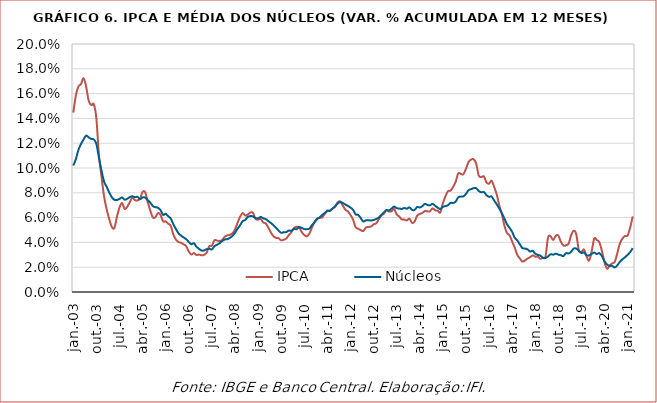
| Category | IPCA | Núcleos |
|---|---|---|
| 2003-01-01 | 0.145 | 0.102 |
| 2003-02-01 | 0.158 | 0.107 |
| 2003-03-01 | 0.166 | 0.115 |
| 2003-04-01 | 0.168 | 0.119 |
| 2003-05-01 | 0.172 | 0.123 |
| 2003-06-01 | 0.166 | 0.126 |
| 2003-07-01 | 0.154 | 0.125 |
| 2003-08-01 | 0.151 | 0.123 |
| 2003-09-01 | 0.151 | 0.123 |
| 2003-10-01 | 0.14 | 0.119 |
| 2003-11-01 | 0.11 | 0.108 |
| 2003-12-01 | 0.093 | 0.098 |
| 2004-01-01 | 0.077 | 0.089 |
| 2004-02-01 | 0.067 | 0.085 |
| 2004-03-01 | 0.059 | 0.08 |
| 2004-04-01 | 0.053 | 0.077 |
| 2004-05-01 | 0.052 | 0.074 |
| 2004-06-01 | 0.061 | 0.074 |
| 2004-07-01 | 0.068 | 0.075 |
| 2004-08-01 | 0.072 | 0.076 |
| 2004-09-01 | 0.067 | 0.074 |
| 2004-10-01 | 0.069 | 0.075 |
| 2004-11-01 | 0.072 | 0.076 |
| 2004-12-01 | 0.076 | 0.077 |
| 2005-01-01 | 0.074 | 0.076 |
| 2005-02-01 | 0.074 | 0.077 |
| 2005-03-01 | 0.075 | 0.075 |
| 2005-04-01 | 0.081 | 0.076 |
| 2005-05-01 | 0.081 | 0.076 |
| 2005-06-01 | 0.073 | 0.074 |
| 2005-07-01 | 0.066 | 0.072 |
| 2005-08-01 | 0.06 | 0.069 |
| 2005-09-01 | 0.06 | 0.068 |
| 2005-10-01 | 0.064 | 0.068 |
| 2005-11-01 | 0.062 | 0.066 |
| 2005-12-01 | 0.057 | 0.062 |
| 2006-01-01 | 0.057 | 0.063 |
| 2006-02-01 | 0.055 | 0.061 |
| 2006-03-01 | 0.053 | 0.059 |
| 2006-04-01 | 0.046 | 0.055 |
| 2006-05-01 | 0.042 | 0.051 |
| 2006-06-01 | 0.04 | 0.047 |
| 2006-07-01 | 0.04 | 0.045 |
| 2006-08-01 | 0.038 | 0.044 |
| 2006-09-01 | 0.037 | 0.043 |
| 2006-10-01 | 0.033 | 0.04 |
| 2006-11-01 | 0.03 | 0.039 |
| 2006-12-01 | 0.031 | 0.039 |
| 2007-01-01 | 0.03 | 0.036 |
| 2007-02-01 | 0.03 | 0.035 |
| 2007-03-01 | 0.03 | 0.033 |
| 2007-04-01 | 0.03 | 0.034 |
| 2007-05-01 | 0.032 | 0.035 |
| 2007-06-01 | 0.037 | 0.035 |
| 2007-07-01 | 0.037 | 0.034 |
| 2007-08-01 | 0.042 | 0.037 |
| 2007-09-01 | 0.041 | 0.038 |
| 2007-10-01 | 0.041 | 0.039 |
| 2007-11-01 | 0.042 | 0.041 |
| 2007-12-01 | 0.045 | 0.042 |
| 2008-01-01 | 0.046 | 0.043 |
| 2008-02-01 | 0.046 | 0.044 |
| 2008-03-01 | 0.047 | 0.045 |
| 2008-04-01 | 0.05 | 0.048 |
| 2008-05-01 | 0.056 | 0.051 |
| 2008-06-01 | 0.061 | 0.054 |
| 2008-07-01 | 0.064 | 0.057 |
| 2008-08-01 | 0.062 | 0.058 |
| 2008-09-01 | 0.063 | 0.061 |
| 2008-10-01 | 0.064 | 0.061 |
| 2008-11-01 | 0.064 | 0.061 |
| 2008-12-01 | 0.059 | 0.06 |
| 2009-01-01 | 0.058 | 0.059 |
| 2009-02-01 | 0.059 | 0.061 |
| 2009-03-01 | 0.056 | 0.059 |
| 2009-04-01 | 0.055 | 0.059 |
| 2009-05-01 | 0.052 | 0.057 |
| 2009-06-01 | 0.048 | 0.056 |
| 2009-07-01 | 0.045 | 0.054 |
| 2009-08-01 | 0.044 | 0.052 |
| 2009-09-01 | 0.043 | 0.05 |
| 2009-10-01 | 0.042 | 0.048 |
| 2009-11-01 | 0.042 | 0.048 |
| 2009-12-01 | 0.043 | 0.048 |
| 2010-01-01 | 0.046 | 0.05 |
| 2010-02-01 | 0.048 | 0.049 |
| 2010-03-01 | 0.052 | 0.051 |
| 2010-04-01 | 0.053 | 0.051 |
| 2010-05-01 | 0.052 | 0.052 |
| 2010-06-01 | 0.048 | 0.052 |
| 2010-07-01 | 0.046 | 0.051 |
| 2010-08-01 | 0.045 | 0.051 |
| 2010-09-01 | 0.047 | 0.051 |
| 2010-10-01 | 0.052 | 0.054 |
| 2010-11-01 | 0.056 | 0.056 |
| 2010-12-01 | 0.059 | 0.059 |
| 2011-01-01 | 0.06 | 0.06 |
| 2011-02-01 | 0.06 | 0.062 |
| 2011-03-01 | 0.063 | 0.064 |
| 2011-04-01 | 0.065 | 0.066 |
| 2011-05-01 | 0.066 | 0.065 |
| 2011-06-01 | 0.067 | 0.067 |
| 2011-07-01 | 0.069 | 0.069 |
| 2011-08-01 | 0.072 | 0.071 |
| 2011-09-01 | 0.073 | 0.073 |
| 2011-10-01 | 0.07 | 0.072 |
| 2011-11-01 | 0.066 | 0.071 |
| 2011-12-01 | 0.065 | 0.069 |
| 2012-01-01 | 0.062 | 0.068 |
| 2012-02-01 | 0.058 | 0.066 |
| 2012-03-01 | 0.052 | 0.063 |
| 2012-04-01 | 0.051 | 0.062 |
| 2012-05-01 | 0.05 | 0.06 |
| 2012-06-01 | 0.049 | 0.057 |
| 2012-07-01 | 0.052 | 0.058 |
| 2012-08-01 | 0.052 | 0.058 |
| 2012-09-01 | 0.053 | 0.058 |
| 2012-10-01 | 0.055 | 0.058 |
| 2012-11-01 | 0.055 | 0.059 |
| 2012-12-01 | 0.058 | 0.06 |
| 2013-01-01 | 0.062 | 0.062 |
| 2013-02-01 | 0.063 | 0.064 |
| 2013-03-01 | 0.066 | 0.066 |
| 2013-04-01 | 0.065 | 0.066 |
| 2013-05-01 | 0.065 | 0.067 |
| 2013-06-01 | 0.067 | 0.069 |
| 2013-07-01 | 0.063 | 0.068 |
| 2013-08-01 | 0.061 | 0.067 |
| 2013-09-01 | 0.059 | 0.067 |
| 2013-10-01 | 0.058 | 0.068 |
| 2013-11-01 | 0.058 | 0.067 |
| 2013-12-01 | 0.059 | 0.068 |
| 2014-01-01 | 0.056 | 0.066 |
| 2014-02-01 | 0.057 | 0.066 |
| 2014-03-01 | 0.062 | 0.069 |
| 2014-04-01 | 0.063 | 0.068 |
| 2014-05-01 | 0.064 | 0.069 |
| 2014-06-01 | 0.065 | 0.071 |
| 2014-07-01 | 0.065 | 0.07 |
| 2014-08-01 | 0.065 | 0.07 |
| 2014-09-01 | 0.067 | 0.071 |
| 2014-10-01 | 0.066 | 0.07 |
| 2014-11-01 | 0.066 | 0.068 |
| 2014-12-01 | 0.064 | 0.067 |
| 2015-01-01 | 0.071 | 0.069 |
| 2015-02-01 | 0.077 | 0.069 |
| 2015-03-01 | 0.081 | 0.07 |
| 2015-04-01 | 0.082 | 0.072 |
| 2015-05-01 | 0.085 | 0.072 |
| 2015-06-01 | 0.089 | 0.073 |
| 2015-07-01 | 0.096 | 0.076 |
| 2015-08-01 | 0.095 | 0.077 |
| 2015-09-01 | 0.095 | 0.077 |
| 2015-10-01 | 0.099 | 0.079 |
| 2015-11-01 | 0.105 | 0.082 |
| 2015-12-01 | 0.107 | 0.083 |
| 2016-01-01 | 0.107 | 0.084 |
| 2016-02-01 | 0.104 | 0.084 |
| 2016-03-01 | 0.094 | 0.081 |
| 2016-04-01 | 0.093 | 0.08 |
| 2016-05-01 | 0.093 | 0.081 |
| 2016-06-01 | 0.088 | 0.078 |
| 2016-07-01 | 0.087 | 0.077 |
| 2016-08-01 | 0.09 | 0.077 |
| 2016-09-01 | 0.085 | 0.074 |
| 2016-10-01 | 0.079 | 0.071 |
| 2016-11-01 | 0.07 | 0.067 |
| 2016-12-01 | 0.063 | 0.064 |
| 2017-01-01 | 0.054 | 0.059 |
| 2017-02-01 | 0.048 | 0.055 |
| 2017-03-01 | 0.046 | 0.052 |
| 2017-04-01 | 0.041 | 0.049 |
| 2017-05-01 | 0.036 | 0.044 |
| 2017-06-01 | 0.03 | 0.042 |
| 2017-07-01 | 0.027 | 0.038 |
| 2017-08-01 | 0.025 | 0.035 |
| 2017-09-01 | 0.025 | 0.035 |
| 2017-10-01 | 0.027 | 0.034 |
| 2017-11-01 | 0.028 | 0.033 |
| 2017-12-01 | 0.029 | 0.033 |
| 2018-01-01 | 0.029 | 0.031 |
| 2018-02-01 | 0.028 | 0.03 |
| 2018-03-01 | 0.027 | 0.029 |
| 2018-04-01 | 0.028 | 0.028 |
| 2018-05-01 | 0.029 | 0.027 |
| 2018-06-01 | 0.044 | 0.029 |
| 2018-07-01 | 0.045 | 0.03 |
| 2018-08-01 | 0.042 | 0.03 |
| 2018-09-01 | 0.045 | 0.031 |
| 2018-10-01 | 0.046 | 0.03 |
| 2018-11-01 | 0.04 | 0.03 |
| 2018-12-01 | 0.037 | 0.029 |
| 2019-01-01 | 0.038 | 0.031 |
| 2019-02-01 | 0.039 | 0.031 |
| 2019-03-01 | 0.046 | 0.032 |
| 2019-04-01 | 0.049 | 0.035 |
| 2019-05-01 | 0.047 | 0.035 |
| 2019-06-01 | 0.034 | 0.033 |
| 2019-07-01 | 0.032 | 0.032 |
| 2019-08-01 | 0.034 | 0.032 |
| 2019-09-01 | 0.029 | 0.03 |
| 2019-10-01 | 0.025 | 0.03 |
| 2019-11-01 | 0.033 | 0.031 |
| 2019-12-01 | 0.043 | 0.032 |
| 2020-01-01 | 0.042 | 0.031 |
| 2020-02-01 | 0.04 | 0.031 |
| 2020-03-01 | 0.033 | 0.029 |
| 2020-04-01 | 0.024 | 0.025 |
| 2020-05-01 | 0.019 | 0.022 |
| 2020-06-01 | 0.021 | 0.021 |
| 2020-07-01 | 0.023 | 0.021 |
| 2020-08-01 | 0.024 | 0.02 |
| 2020-09-01 | 0.031 | 0.022 |
| 2020-10-01 | 0.039 | 0.024 |
| 2020-11-01 | 0.043 | 0.026 |
| 2020-12-01 | 0.045 | 0.028 |
| 2021-01-01 | 0.046 | 0.03 |
| 2021-02-01 | 0.052 | 0.032 |
| 2021-03-01 | 0.061 | 0.035 |